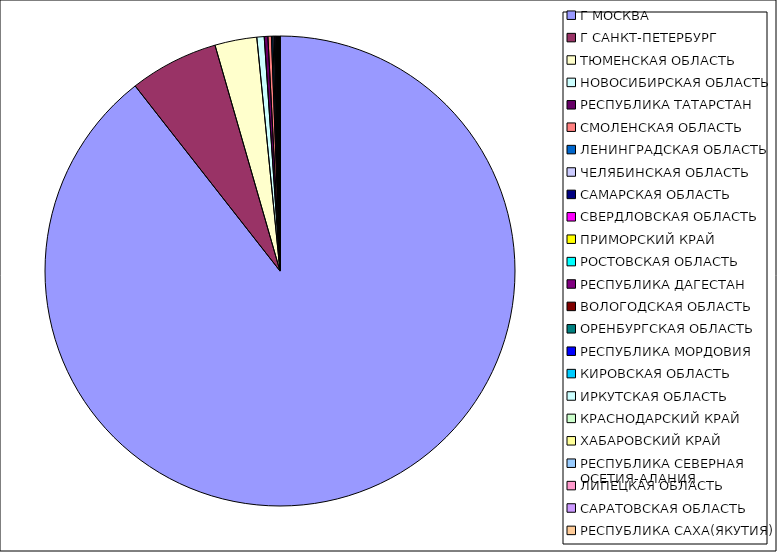
| Category | Оборот |
|---|---|
| Г МОСКВА | 0.894 |
| Г САНКТ-ПЕТЕРБУРГ | 0.061 |
| ТЮМЕНСКАЯ ОБЛАСТЬ | 0.029 |
| НОВОСИБИРСКАЯ ОБЛАСТЬ | 0.005 |
| РЕСПУБЛИКА ТАТАРСТАН | 0.003 |
| СМОЛЕНСКАЯ ОБЛАСТЬ | 0.002 |
| ЛЕНИНГРАДСКАЯ ОБЛАСТЬ | 0.001 |
| ЧЕЛЯБИНСКАЯ ОБЛАСТЬ | 0.001 |
| САМАРСКАЯ ОБЛАСТЬ | 0.001 |
| СВЕРДЛОВСКАЯ ОБЛАСТЬ | 0.001 |
| ПРИМОРСКИЙ КРАЙ | 0 |
| РОСТОВСКАЯ ОБЛАСТЬ | 0 |
| РЕСПУБЛИКА ДАГЕСТАН | 0 |
| ВОЛОГОДСКАЯ ОБЛАСТЬ | 0 |
| ОРЕНБУРГСКАЯ ОБЛАСТЬ | 0 |
| РЕСПУБЛИКА МОРДОВИЯ | 0 |
| КИРОВСКАЯ ОБЛАСТЬ | 0 |
| ИРКУТСКАЯ ОБЛАСТЬ | 0 |
| КРАСНОДАРСКИЙ КРАЙ | 0 |
| ХАБАРОВСКИЙ КРАЙ | 0 |
| РЕСПУБЛИКА СЕВЕРНАЯ ОСЕТИЯ-АЛАНИЯ | 0 |
| ЛИПЕЦКАЯ ОБЛАСТЬ | 0 |
| САРАТОВСКАЯ ОБЛАСТЬ | 0 |
| РЕСПУБЛИКА САХА(ЯКУТИЯ) | 0 |
| АРХАНГЕЛЬСКАЯ ОБЛАСТЬ | 0 |
| УДМУРТСКАЯ РЕСПУБЛИКА | 0 |
| СТАВРОПОЛЬСКИЙ КРАЙ | 0 |
| НИЖЕГОРОДСКАЯ ОБЛАСТЬ | 0 |
| КАРАЧАЕВО-ЧЕРКЕССКАЯ РЕСПУБЛИКА | 0 |
| ТУЛЬСКАЯ ОБЛАСТЬ | 0 |